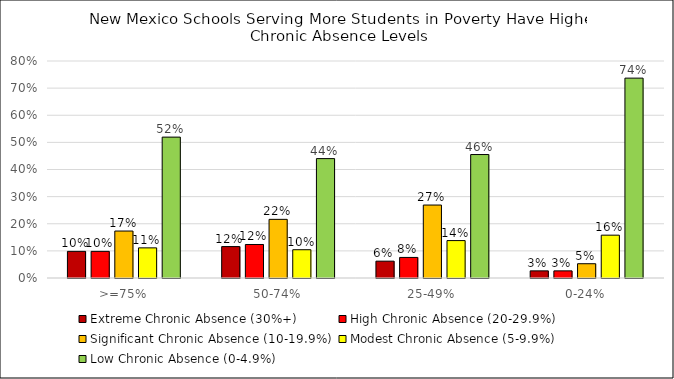
| Category | Extreme Chronic Absence (30%+) | High Chronic Absence (20-29.9%) | Significant Chronic Absence (10-19.9%) | Modest Chronic Absence (5-9.9%) | Low Chronic Absence (0-4.9%) |
|---|---|---|---|---|---|
| >=75% | 0.098 | 0.098 | 0.173 | 0.111 | 0.519 |
| 50-74% | 0.116 | 0.124 | 0.216 | 0.104 | 0.44 |
| 25-49% | 0.062 | 0.076 | 0.269 | 0.138 | 0.455 |
| 0-24% | 0.026 | 0.026 | 0.053 | 0.158 | 0.737 |